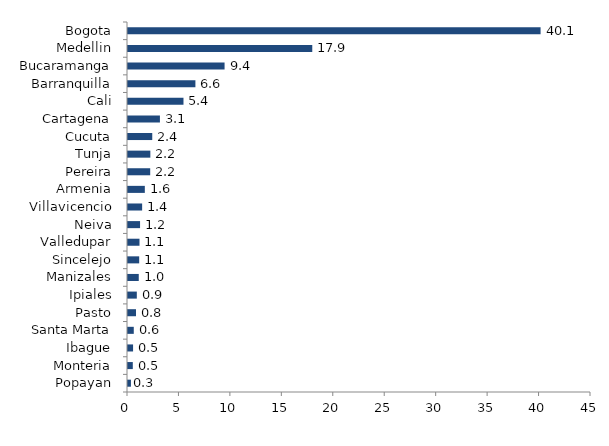
| Category | Series 0 |
|---|---|
| Popayan | 0.285 |
| Monteria | 0.467 |
| Ibague | 0.493 |
| Santa Marta | 0.561 |
| Pasto | 0.776 |
| Ipiales | 0.857 |
| Manizales | 1.046 |
| Sincelejo | 1.088 |
| Valledupar | 1.117 |
| Neiva | 1.172 |
| Villavicencio | 1.374 |
| Armenia | 1.635 |
| Pereira | 2.159 |
| Tunja | 2.172 |
| Cucuta | 2.357 |
| Cartagena | 3.102 |
| Cali | 5.392 |
| Barranquilla | 6.551 |
| Bucaramanga | 9.386 |
| Medellin | 17.909 |
| Bogota | 40.1 |